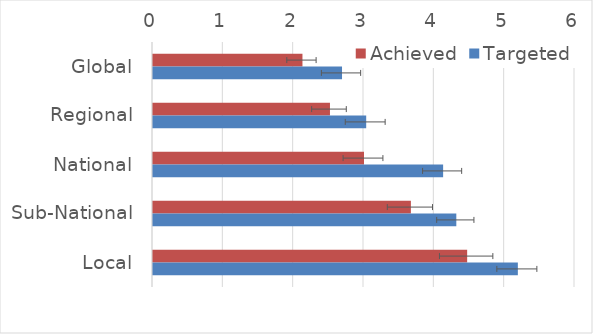
| Category | Achieved | Targeted |
|---|---|---|
| Global | 2.125 | 2.688 |
| Regional | 2.516 | 3.031 |
| National | 3 | 4.125 |
| Sub-National | 3.667 | 4.312 |
| Local | 4.467 | 5.188 |